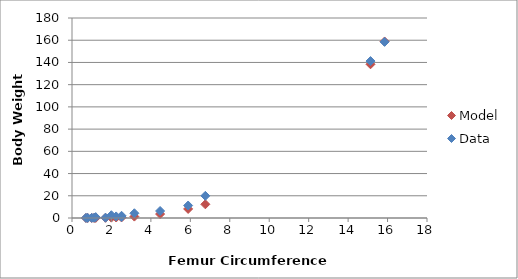
| Category | Model |
|---|---|
| 0.7943 | 0.02 |
| 0.7079 | 0.014 |
| 1.0 | 0.04 |
| 1.122 | 0.056 |
| 1.6982 | 0.195 |
| 1.2023 | 0.069 |
| 1.9953 | 0.317 |
| 2.2387 | 0.448 |
| 2.5119 | 0.632 |
| 2.5119 | 0.632 |
| 3.1623 | 1.262 |
| 4.4668 | 3.556 |
| 5.8884 | 8.146 |
| 6.7608 | 12.33 |
| 15.136 | 138.359 |
| 15.85 | 158.877 |